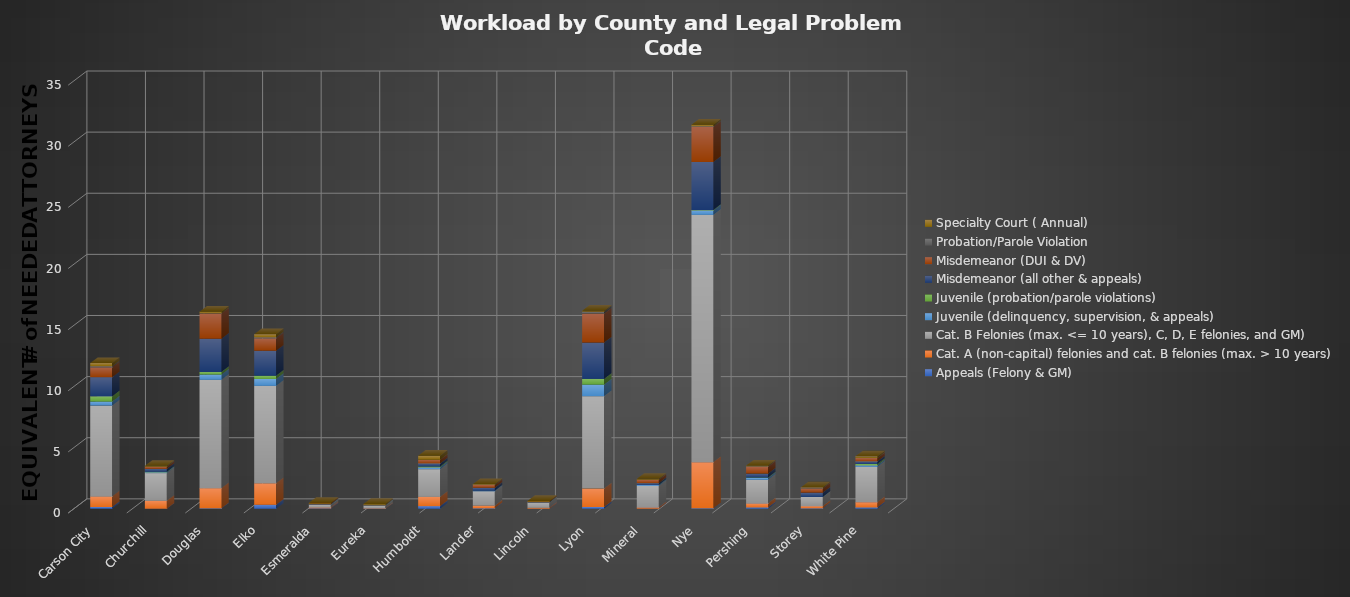
| Category | Appeals (Felony & GM) | Cat. A (non-capital) felonies and cat. B felonies (max. > 10 years) | Cat. B Felonies (max. <= 10 years), C, D, E felonies, and GM) | Death Penalty | Juvenile (delinquency, supervision, & appeals) | Juvenile (probation/parole violations) | Misdemeanor (all other & appeals) | Misdemeanor (DUI & DV) | Probation/Parole Violation | Specialty Court ( Annual) |
|---|---|---|---|---|---|---|---|---|---|---|
| Carson City | 0.144 | 0.862 | 7.439 |  | 0.323 | 0.429 | 1.564 | 0.804 | 0.095 | 0.259 |
| Churchill | 0 | 0.646 | 2.269 |  | 0.065 | 0.037 | 0.246 | 0.165 | 0.017 | 0.065 |
| Douglas | 0.036 | 1.652 | 8.861 |  | 0.431 | 0.205 | 2.723 | 2.061 | 0.026 | 0.129 |
| Elko | 0.323 | 1.759 | 7.971 |  | 0.565 | 0.261 | 2.047 | 1.012 | 0.086 | 0.259 |
| Esmeralda | 0.036 | 0.072 | 0.215 |  | 0 | 0.019 | 0.022 | 0.057 | 0 | 0.065 |
| Eureka | 0 | 0.036 | 0.215 |  | 0.005 | 0 | 0.022 | 0.05 | 0 | 0.065 |
| Humboldt | 0.215 | 0.754 | 2.269 |  | 0.14 | 0.075 | 0.25 | 0.302 | 0.006 | 0.323 |
| Lander | 0.036 | 0.215 | 1.178 |  | 0.043 | 0 | 0.241 | 0.23 | 0.006 | 0.065 |
| Lincoln | 0 | 0.072 | 0.445 |  | 0 | 0 | 0.022 | 0.036 | 0.003 | 0.065 |
| Lyon | 0.144 | 1.508 | 7.554 |  | 0.948 | 0.467 | 2.973 | 2.362 | 0.175 | 0.065 |
| Mineral | 0 | 0.108 | 1.752 |  | 0.081 | 0 | 0.155 | 0.273 | 0.011 | 0.065 |
| Nye | 0.036 | 3.77 | 20.236 |  | 0.361 | 0.037 | 3.929 | 2.858 | 0.06 | 0.129 |
| Pershing | 0.108 | 0.323 | 1.939 |  | 0.145 | 0.037 | 0.323 | 0.56 | 0.029 | 0.065 |
| Storey | 0.036 | 0.18 | 0.747 |  | 0 | 0 | 0.353 | 0.345 | 0.023 | 0.065 |
| White Pine | 0.108 | 0.431 | 2.887 |  | 0.124 | 0.112 | 0.215 | 0.273 | 0.011 | 0.129 |